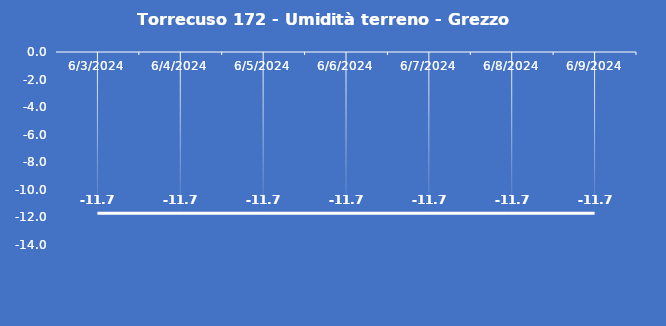
| Category | Torrecuso 172 - Umidità terreno - Grezzo (%VWC) |
|---|---|
| 6/3/24 | -11.7 |
| 6/4/24 | -11.7 |
| 6/5/24 | -11.7 |
| 6/6/24 | -11.7 |
| 6/7/24 | -11.7 |
| 6/8/24 | -11.7 |
| 6/9/24 | -11.7 |